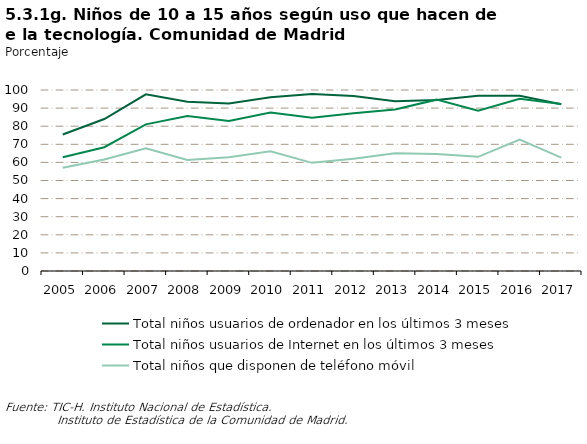
| Category | Total niños usuarios de ordenador en los últimos 3 meses | Total niños usuarios de Internet en los últimos 3 meses | Total niños que disponen de teléfono móvil |
|---|---|---|---|
| 2005.0 | 75.399 | 62.846 | 57.019 |
| 2006.0 | 83.968 | 68.395 | 61.641 |
| 2007.0 | 97.595 | 80.998 | 67.8 |
| 2008.0 | 93.52 | 85.587 | 61.378 |
| 2009.0 | 92.6 | 82.9 | 62.8 |
| 2010.0 | 96 | 87.5 | 66.2 |
| 2011.0 | 97.798 | 84.715 | 59.747 |
| 2012.0 | 96.698 | 87.188 | 62.003 |
| 2013.0 | 93.827 | 89.257 | 65.089 |
| 2014.0 | 94.54 | 94.667 | 64.653 |
| 2015.0 | 96.817 | 88.561 | 63.094 |
| 2016.0 | 96.852 | 95.101 | 72.58 |
| 2017.0 | 92.167 | 92.318 | 62.672 |